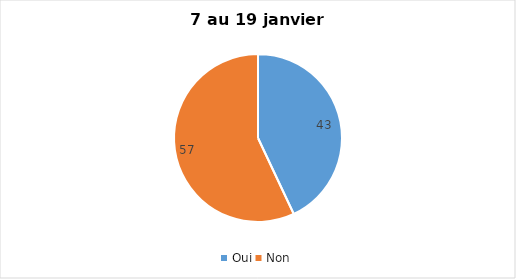
| Category | Series 0 |
|---|---|
| Oui | 43 |
| Non | 57 |